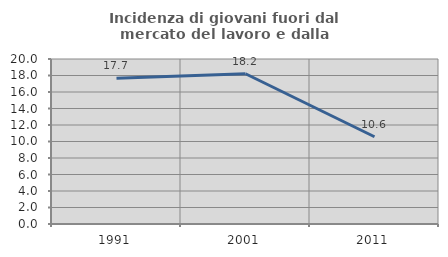
| Category | Incidenza di giovani fuori dal mercato del lavoro e dalla formazione  |
|---|---|
| 1991.0 | 17.681 |
| 2001.0 | 18.214 |
| 2011.0 | 10.579 |